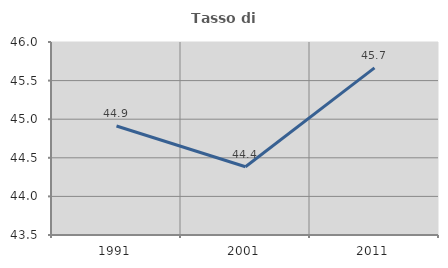
| Category | Tasso di occupazione   |
|---|---|
| 1991.0 | 44.912 |
| 2001.0 | 44.384 |
| 2011.0 | 45.664 |